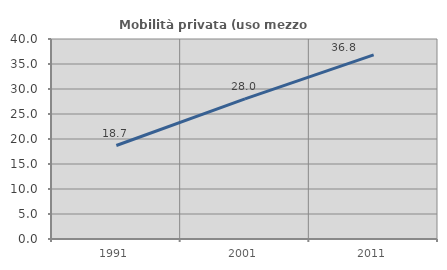
| Category | Mobilità privata (uso mezzo privato) |
|---|---|
| 1991.0 | 18.699 |
| 2001.0 | 28.035 |
| 2011.0 | 36.819 |